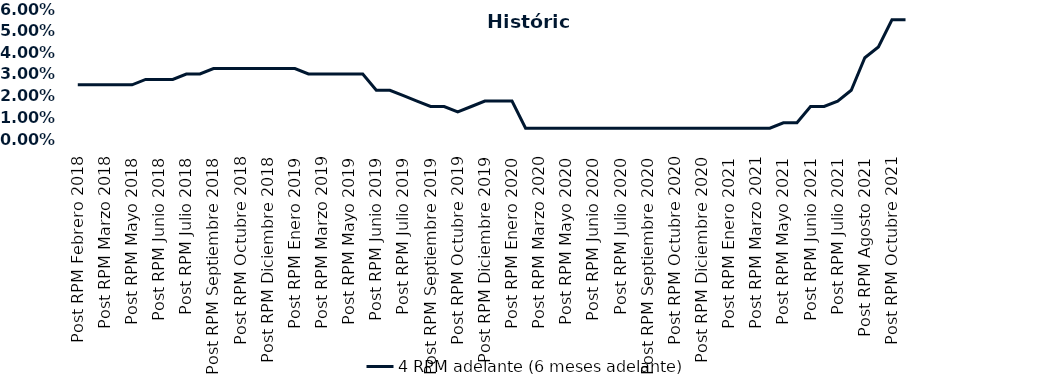
| Category | 4 RPM adelante (6 meses adelante) |
|---|---|
| Post RPM Febrero 2018 | 0.025 |
| Pre RPM Marzo 2018 | 0.025 |
| Post RPM Marzo 2018 | 0.025 |
| Pre RPM Mayo 2018 | 0.025 |
| Post RPM Mayo 2018 | 0.025 |
| Pre RPM Junio 2018 | 0.028 |
| Post RPM Junio 2018 | 0.028 |
| Pre RPM Julio 2018 | 0.028 |
| Post RPM Julio 2018 | 0.03 |
| Pre RPM Septiembre 2018 | 0.03 |
| Post RPM Septiembre 2018 | 0.032 |
| Pre RPM Octubre 2018 | 0.032 |
| Post RPM Octubre 2018 | 0.032 |
| Pre RPM Diciembre 2018 | 0.032 |
| Post RPM Diciembre 2018 | 0.032 |
| Pre RPM Enero 2019 | 0.032 |
| Post RPM Enero 2019 | 0.032 |
| Pre RPM Marzo 2019 | 0.03 |
| Post RPM Marzo 2019 | 0.03 |
| Pre RPM Mayo 2019 | 0.03 |
| Post RPM Mayo 2019 | 0.03 |
| Pre RPM Junio 2019 | 0.03 |
| Post RPM Junio 2019 | 0.022 |
| Pre RPM Julio 2019 | 0.022 |
| Post RPM Julio 2019 | 0.02 |
| Pre RPM Septiembre 2019 | 0.018 |
| Post RPM Septiembre 2019 | 0.015 |
| Pre RPM Octubre 2019 | 0.015 |
| Post RPM Octubre 2019 | 0.012 |
| Pre RPM Diciembre 2019 | 0.015 |
| Post RPM Diciembre 2019 | 0.018 |
| Pre RPM Enero 2020 | 0.018 |
| Post RPM Enero 2020 | 0.018 |
| Pre RPM Marzo 2020 | 0.005 |
| Post RPM Marzo 2020 | 0.005 |
| Pre RPM Mayo 2020 | 0.005 |
| Post RPM Mayo 2020 | 0.005 |
| Pre RPM Junio 2020 | 0.005 |
| Post RPM Junio 2020 | 0.005 |
| Pre RPM Julio 2020 | 0.005 |
| Post RPM Julio 2020 | 0.005 |
| Pre RPM Septiembre 2020 | 0.005 |
| Post RPM Septiembre 2020 | 0.005 |
| Pre RPM Octubre 2020 | 0.005 |
| Post RPM Octubre 2020 | 0.005 |
| Pre RPM Diciembre 2020 | 0.005 |
| Post RPM Diciembre 2020 | 0.005 |
| Pre RPM Enero 2021 | 0.005 |
| Post RPM Enero 2021 | 0.005 |
| Pre RPM Marzo 2021 | 0.005 |
| Post RPM Marzo 2021 | 0.005 |
| Pre RPM Mayo 2021 | 0.005 |
| Post RPM Mayo 2021 | 0.008 |
| Pre RPM Junio 2021 | 0.008 |
| Post RPM Junio 2021 | 0.015 |
| Pre RPM Julio 2021 | 0.015 |
| Post RPM Julio 2021 | 0.018 |
| Pre RPM Agosto 2021 | 0.022 |
| Post RPM Agosto 2021 | 0.038 |
| Pre RPM Octubre 2021 | 0.042 |
| Post RPM Octubre 2021 | 0.055 |
| Pre RPM Diciembre 2021 | 0.055 |